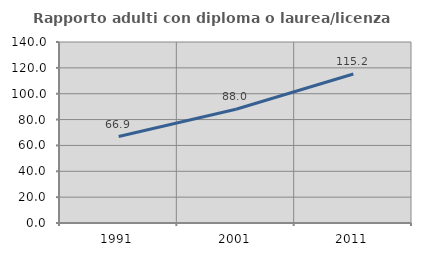
| Category | Rapporto adulti con diploma o laurea/licenza media  |
|---|---|
| 1991.0 | 66.867 |
| 2001.0 | 87.963 |
| 2011.0 | 115.249 |